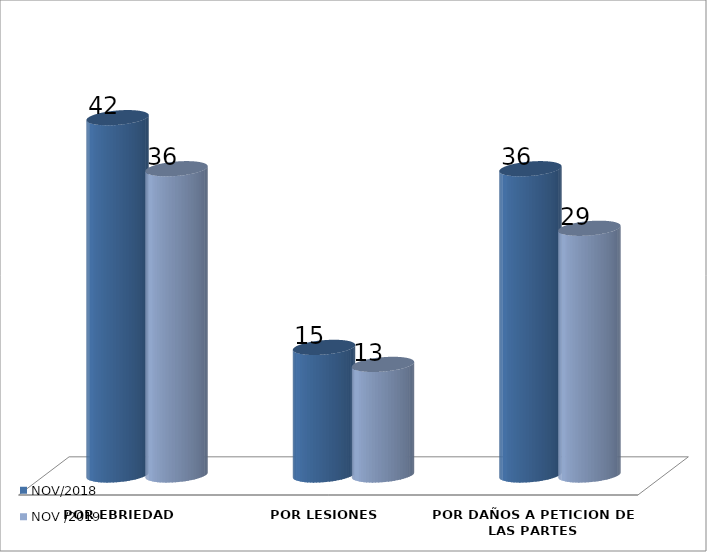
| Category | NOV/2018 | NOV /2019 |
|---|---|---|
| POR EBRIEDAD | 42 | 36 |
| POR LESIONES | 15 | 13 |
| POR DAÑOS A PETICION DE LAS PARTES | 36 | 29 |